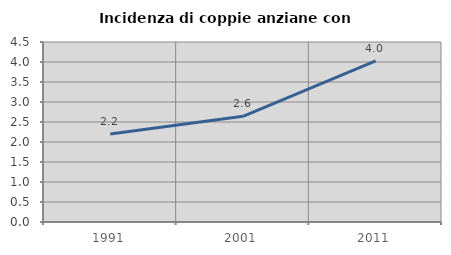
| Category | Incidenza di coppie anziane con figli |
|---|---|
| 1991.0 | 2.2 |
| 2001.0 | 2.642 |
| 2011.0 | 4.028 |